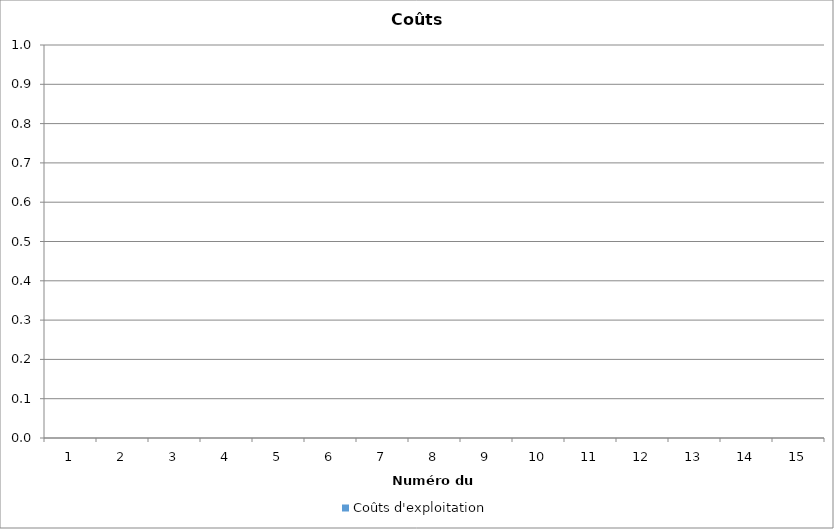
| Category | Coûts d'exploitation |
|---|---|
| 0 | 0 |
| 1 | 0 |
| 2 | 0 |
| 3 | 0 |
| 4 | 0 |
| 5 | 0 |
| 6 | 0 |
| 7 | 0 |
| 8 | 0 |
| 9 | 0 |
| 10 | 0 |
| 11 | 0 |
| 12 | 0 |
| 13 | 0 |
| 14 | 0 |